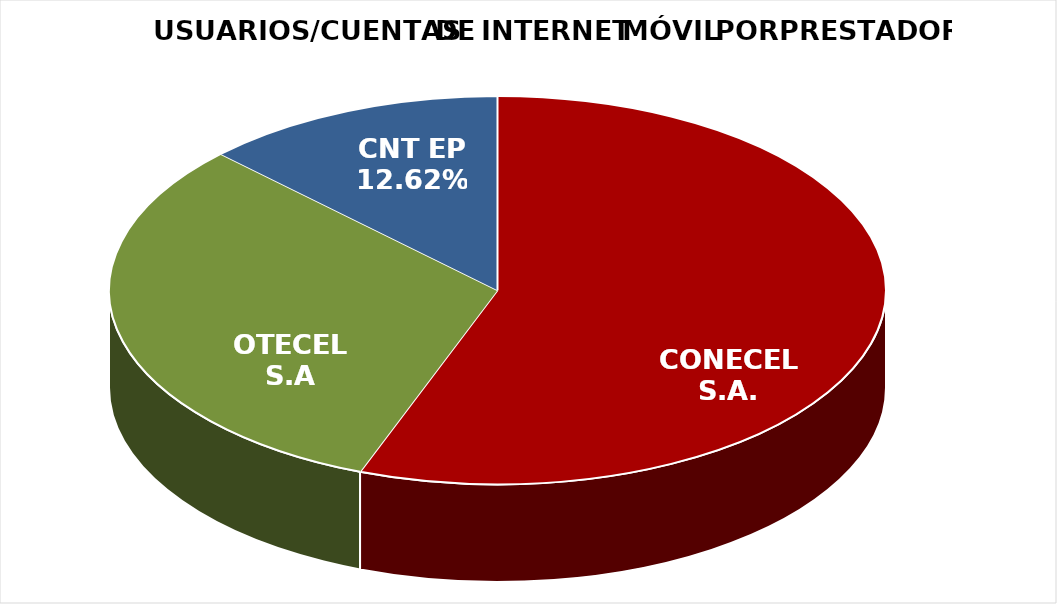
| Category | Series 0 | Series 1 |
|---|---|---|
| CONECEL S.A. | 5711638 | 0.558 |
| OTECEL S.A | 3239674 | 0.316 |
| CNT EP | 1292910 | 0.126 |